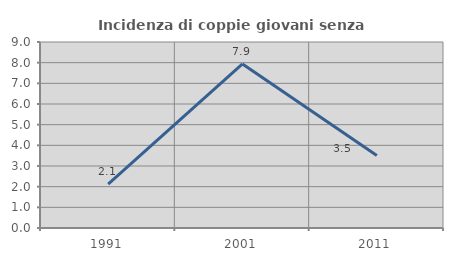
| Category | Incidenza di coppie giovani senza figli |
|---|---|
| 1991.0 | 2.128 |
| 2001.0 | 7.937 |
| 2011.0 | 3.509 |